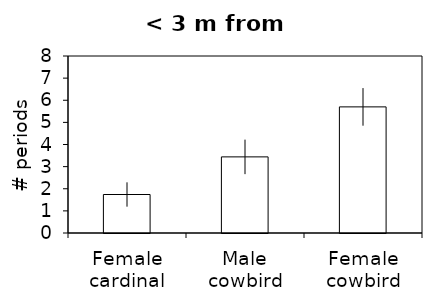
| Category | Series 0 |
|---|---|
| Female cardinal | 1.74 |
| Male cowbird | 3.44 |
| Female cowbird | 5.7 |